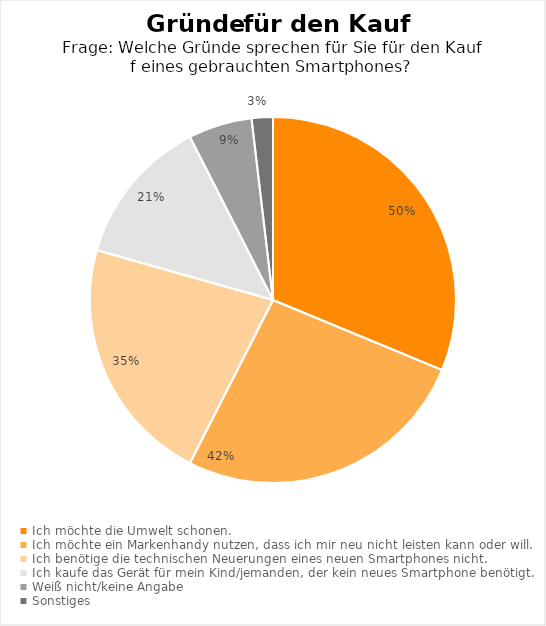
| Category | Series 0 |
|---|---|
| Ich möchte die Umwelt schonen. | 0.5 |
| Ich möchte ein Markenhandy nutzen, dass ich mir neu nicht leisten kann oder will. | 0.42 |
| Ich benötige die technischen Neuerungen eines neuen Smartphones nicht. | 0.35 |
| Ich kaufe das Gerät für mein Kind/jemanden, der kein neues Smartphone benötigt. | 0.21 |
| Weiß nicht/keine Angabe | 0.09 |
| Sonstiges | 0.03 |